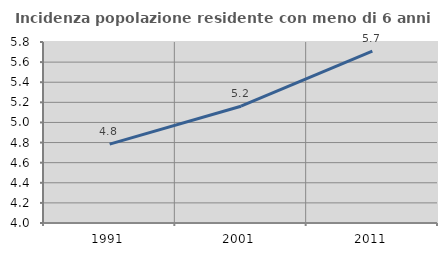
| Category | Incidenza popolazione residente con meno di 6 anni |
|---|---|
| 1991.0 | 4.784 |
| 2001.0 | 5.161 |
| 2011.0 | 5.708 |